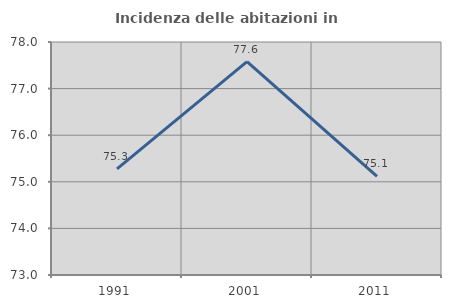
| Category | Incidenza delle abitazioni in proprietà  |
|---|---|
| 1991.0 | 75.277 |
| 2001.0 | 77.58 |
| 2011.0 | 75.116 |